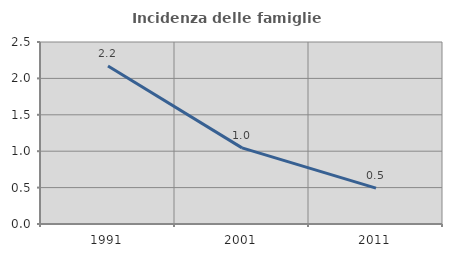
| Category | Incidenza delle famiglie numerose |
|---|---|
| 1991.0 | 2.17 |
| 2001.0 | 1.045 |
| 2011.0 | 0.493 |